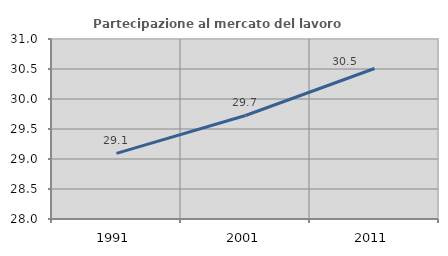
| Category | Partecipazione al mercato del lavoro  femminile |
|---|---|
| 1991.0 | 29.094 |
| 2001.0 | 29.725 |
| 2011.0 | 30.508 |